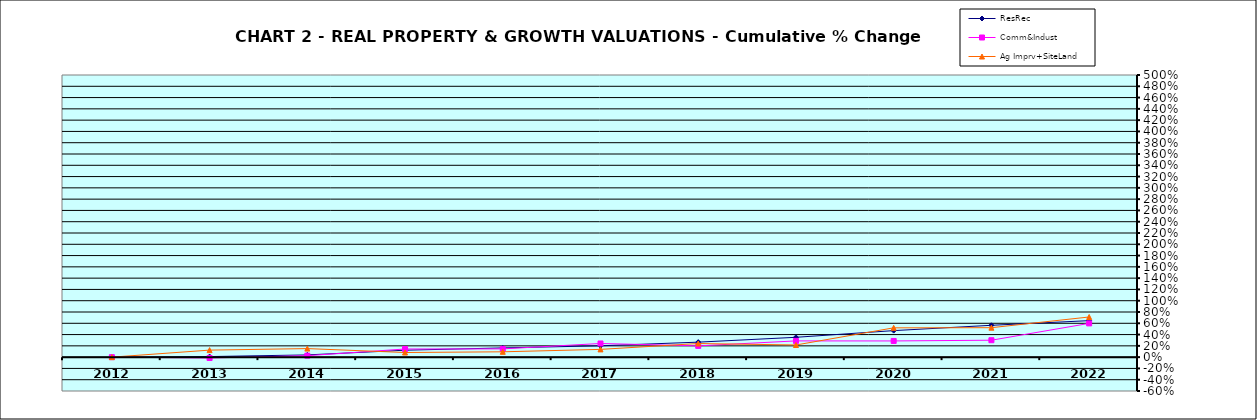
| Category | ResRec | Comm&Indust | Ag Imprv+SiteLand |
|---|---|---|---|
| 2012.0 | -0.005 | 0 | 0 |
| 2013.0 | 0.01 | -0.015 | 0.125 |
| 2014.0 | 0.039 | 0.026 | 0.152 |
| 2015.0 | 0.123 | 0.144 | 0.082 |
| 2016.0 | 0.164 | 0.147 | 0.095 |
| 2017.0 | 0.201 | 0.242 | 0.137 |
| 2018.0 | 0.266 | 0.2 | 0.241 |
| 2019.0 | 0.351 | 0.288 | 0.215 |
| 2020.0 | 0.47 | 0.287 | 0.519 |
| 2021.0 | 0.565 | 0.3 | 0.522 |
| 2022.0 | 0.647 | 0.598 | 0.712 |